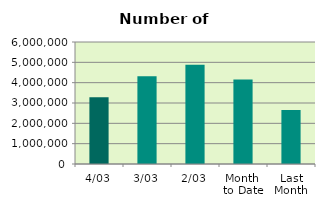
| Category | Series 0 |
|---|---|
| 4/03 | 3276906 |
| 3/03 | 4311302 |
| 2/03 | 4881252 |
| Month 
to Date | 4156486.667 |
| Last
Month | 2656039 |